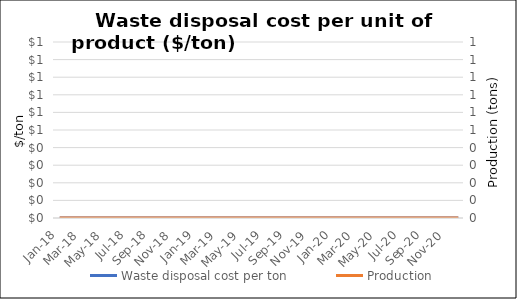
| Category | Waste disposal cost per ton |
|---|---|
| Jan-18 | 0 |
| Feb-18 | 0 |
| Mar-18 | 0 |
| Apr-18 | 0 |
| May-18 | 0 |
| Jun-18 | 0 |
| Jul-18 | 0 |
| Aug-18 | 0 |
| Sep-18 | 0 |
| Oct-18 | 0 |
| Nov-18 | 0 |
| Dec-18 | 0 |
| Jan-19 | 0 |
| Feb-19 | 0 |
| Mar-19 | 0 |
| Apr-19 | 0 |
| May-19 | 0 |
| Jun-19 | 0 |
| Jul-19 | 0 |
| Aug-19 | 0 |
| Sep-19 | 0 |
| Oct-19 | 0 |
| Nov-19 | 0 |
| Dec-19 | 0 |
| Jan-20 | 0 |
| Feb-20 | 0 |
| Mar-20 | 0 |
| Apr-20 | 0 |
| May-20 | 0 |
| Jun-20 | 0 |
| Jul-20 | 0 |
| Aug-20 | 0 |
| Sep-20 | 0 |
| Oct-20 | 0 |
| Nov-20 | 0 |
| Dec-20 | 0 |